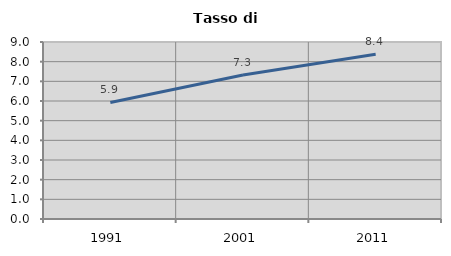
| Category | Tasso di disoccupazione   |
|---|---|
| 1991.0 | 5.925 |
| 2001.0 | 7.326 |
| 2011.0 | 8.374 |